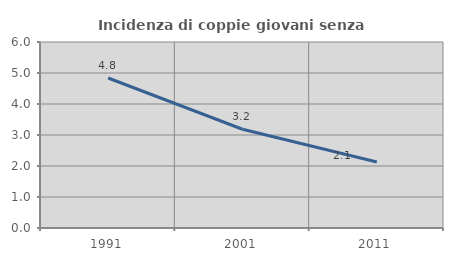
| Category | Incidenza di coppie giovani senza figli |
|---|---|
| 1991.0 | 4.839 |
| 2001.0 | 3.185 |
| 2011.0 | 2.128 |